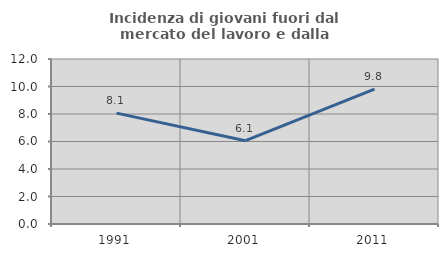
| Category | Incidenza di giovani fuori dal mercato del lavoro e dalla formazione  |
|---|---|
| 1991.0 | 8.065 |
| 2001.0 | 6.061 |
| 2011.0 | 9.804 |